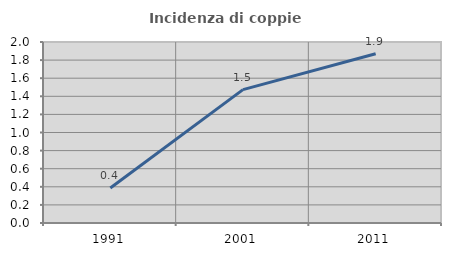
| Category | Incidenza di coppie miste |
|---|---|
| 1991.0 | 0.386 |
| 2001.0 | 1.473 |
| 2011.0 | 1.87 |